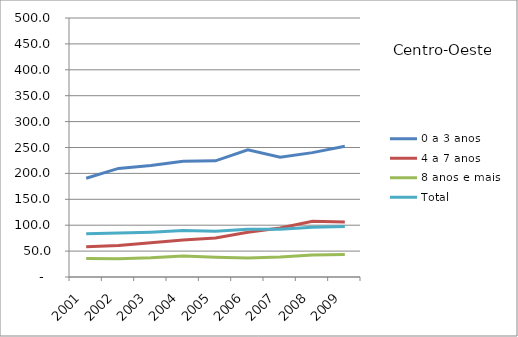
| Category | 0 a 3 anos | 4 a 7 anos | 8 anos e mais | Total |
|---|---|---|---|---|
| 2001.0 | 190.7 | 58.4 | 35.7 | 83.3 |
| 2002.0 | 209.6 | 60.7 | 35.4 | 84.8 |
| 2003.0 | 215.2 | 66.2 | 37 | 86.6 |
| 2004.0 | 223.6 | 71.4 | 40.5 | 89.7 |
| 2005.0 | 224.2 | 75.1 | 38.3 | 88.3 |
| 2006.0 | 245.6 | 86.4 | 36.7 | 92.2 |
| 2007.0 | 231.4 | 94.5 | 38.6 | 92.3 |
| 2008.0 | 240.1 | 107.6 | 42.4 | 96.1 |
| 2009.0 | 252.5 | 106.2 | 43.6 | 97.3 |